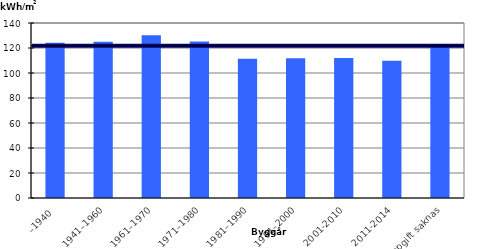
| Category | Genomsnitt per byggår (KWh/m2) |
|---|---|
| –1940 | 124.153 |
| 1941–1960 | 124.959 |
| 1961–1970 | 130.292 |
| 1971–1980 | 125.282 |
| 1981–1990 | 111.464 |
| 1991–2000 | 111.83 |
| 2001-2010 | 112.048 |
| 2011-2014 | 109.896 |
| Uppgift saknas | 122.58 |